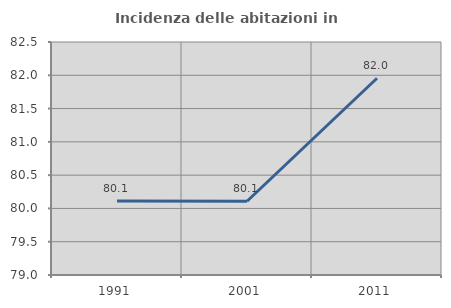
| Category | Incidenza delle abitazioni in proprietà  |
|---|---|
| 1991.0 | 80.112 |
| 2001.0 | 80.108 |
| 2011.0 | 81.956 |